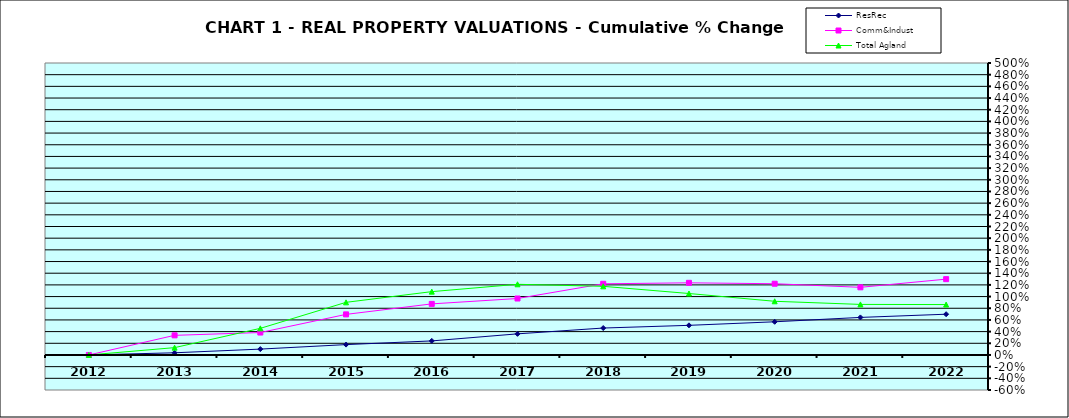
| Category | ResRec | Comm&Indust | Total Agland |
|---|---|---|---|
| 2012.0 | 0 | 0 | 0 |
| 2013.0 | 0.037 | 0.336 | 0.126 |
| 2014.0 | 0.1 | 0.384 | 0.456 |
| 2015.0 | 0.178 | 0.695 | 0.901 |
| 2016.0 | 0.241 | 0.875 | 1.085 |
| 2017.0 | 0.362 | 0.967 | 1.21 |
| 2018.0 | 0.461 | 1.219 | 1.176 |
| 2019.0 | 0.507 | 1.235 | 1.052 |
| 2020.0 | 0.568 | 1.22 | 0.919 |
| 2021.0 | 0.643 | 1.158 | 0.866 |
| 2022.0 | 0.698 | 1.298 | 0.863 |